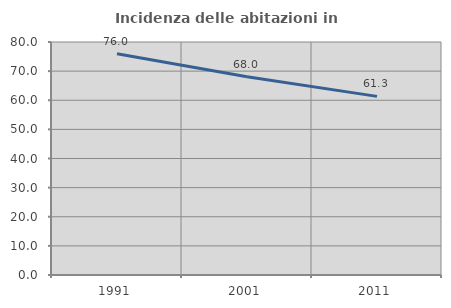
| Category | Incidenza delle abitazioni in proprietà  |
|---|---|
| 1991.0 | 75.989 |
| 2001.0 | 68.037 |
| 2011.0 | 61.325 |